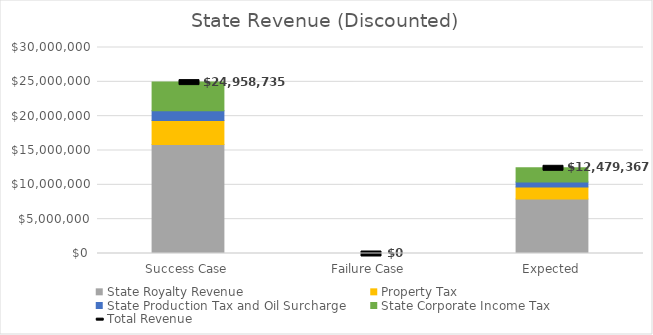
| Category | State Royalty Revenue | Property Tax | State Production Tax and Oil Surcharge | State Corporate Income Tax |
|---|---|---|---|---|
| Success Case | 15860383.776 | 3492755.998 | 1453157.006 | 4152437.805 |
| Failure Case | 0 | 0 | 0 | 0 |
| Expected | 7930191.888 | 1746377.999 | 726578.503 | 2076218.902 |